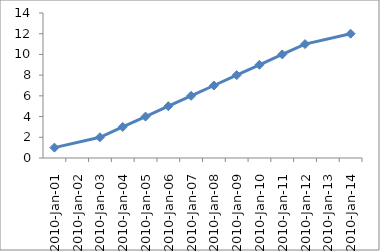
| Category | Series 1 |
|---|---|
| 2010-01-01 | 1 |
| 2010-01-03 | 2 |
| 2010-01-04 | 3 |
| 2010-01-05 | 4 |
| 2010-01-06 | 5 |
| 2010-01-07 | 6 |
| 2010-01-08 | 7 |
| 2010-01-09 | 8 |
| 2010-01-10 | 9 |
| 2010-01-11 | 10 |
| 2010-01-12 | 11 |
| 2010-01-14 | 12 |